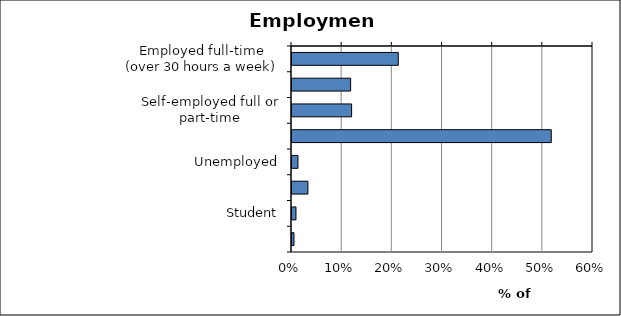
| Category | Series 0 |
|---|---|
| Employed full-time (over 30 hours a week) | 0.212 |
| Employed part-time (under 30 hours a week) | 0.117 |
| Self-employed full or part-time | 0.119 |
| Retired | 0.517 |
| Unemployed | 0.012 |
| Unwaged homemaker | 0.032 |
| Student | 0.008 |
| Full or part-time carer | 0.004 |